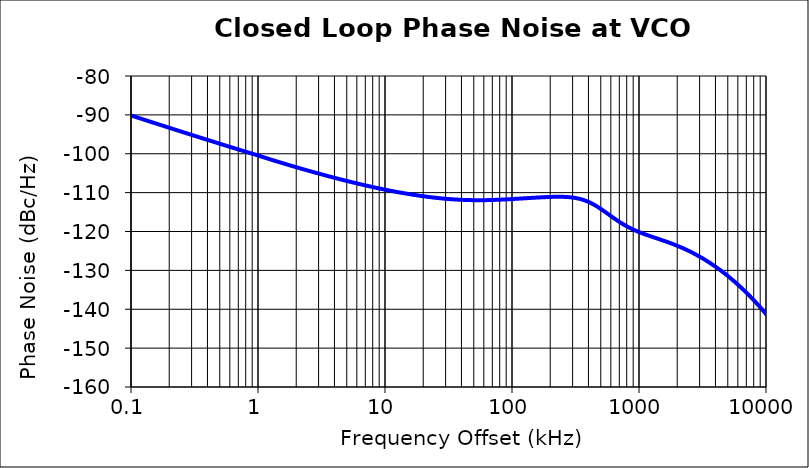
| Category | Series 2 |
|---|---|
| 0.1 | -90.148 |
| 0.1122018454301966 | -90.679 |
| 0.12589254117941703 | -91.208 |
| 0.14125375446227575 | -91.735 |
| 0.15848931924611176 | -92.261 |
| 0.17782794100389276 | -92.786 |
| 0.19952623149688853 | -93.309 |
| 0.22387211385683461 | -93.83 |
| 0.2511886431509588 | -94.35 |
| 0.28183829312644626 | -94.868 |
| 0.316227766016839 | -95.384 |
| 0.3548133892335767 | -95.899 |
| 0.39810717055349865 | -96.412 |
| 0.44668359215096465 | -96.923 |
| 0.501187233627274 | -97.432 |
| 0.5623413251903512 | -97.94 |
| 0.6309573444801956 | -98.445 |
| 0.7079457843841407 | -98.947 |
| 0.7943282347242847 | -99.447 |
| 0.8912509381337492 | -99.945 |
| 1.0 | -100.44 |
| 1.122018454301966 | -100.966 |
| 1.2589254117941702 | -101.482 |
| 1.4125375446227577 | -101.989 |
| 1.5848931924611176 | -102.486 |
| 1.7782794100389276 | -102.975 |
| 1.9952623149688853 | -103.456 |
| 2.2387211385683456 | -103.929 |
| 2.5118864315095877 | -104.394 |
| 2.818382931264463 | -104.85 |
| 3.1622776601683897 | -105.299 |
| 3.548133892335767 | -105.739 |
| 3.9810717055349865 | -106.17 |
| 4.466835921509647 | -106.592 |
| 5.011872336272741 | -107.004 |
| 5.623413251903512 | -107.406 |
| 6.309573444801956 | -107.797 |
| 7.079457843841406 | -108.176 |
| 7.943282347242847 | -108.543 |
| 8.912509381337491 | -108.897 |
| 10.0 | -109.238 |
| 11.22018454301966 | -109.561 |
| 12.589254117941703 | -109.869 |
| 14.125375446227576 | -110.16 |
| 15.848931924611176 | -110.434 |
| 17.782794100389278 | -110.689 |
| 19.952623149688854 | -110.924 |
| 22.387211385683457 | -111.139 |
| 25.118864315095877 | -111.331 |
| 28.183829312644626 | -111.499 |
| 31.6227766016839 | -111.642 |
| 35.48133892335767 | -111.759 |
| 39.81071705534986 | -111.848 |
| 44.668359215096466 | -111.909 |
| 50.1187233627274 | -111.943 |
| 56.23413251903512 | -111.949 |
| 63.09573444801956 | -111.929 |
| 70.79457843841408 | -111.886 |
| 79.43282347242847 | -111.823 |
| 89.12509381337492 | -111.744 |
| 100.0 | -111.653 |
| 112.20184543019658 | -111.556 |
| 125.89254117941702 | -111.455 |
| 141.25375446227577 | -111.356 |
| 158.48931924611176 | -111.262 |
| 177.82794100389276 | -111.178 |
| 199.52623149688853 | -111.111 |
| 223.8721138568346 | -111.072 |
| 251.1886431509588 | -111.082 |
| 281.8382931264463 | -111.17 |
| 316.2277660168389 | -111.378 |
| 354.8133892335767 | -111.759 |
| 398.1071705534987 | -112.356 |
| 446.68359215096467 | -113.186 |
| 501.18723362727405 | -114.213 |
| 562.3413251903512 | -115.36 |
| 630.9573444801955 | -116.526 |
| 707.9457843841408 | -117.624 |
| 794.3282347242847 | -118.599 |
| 891.2509381337492 | -119.435 |
| 1000.0 | -120.146 |
| 1122.018454301966 | -120.766 |
| 1258.9254117941703 | -121.333 |
| 1412.5375446227577 | -121.879 |
| 1584.8931924611177 | -122.436 |
| 1778.2794100389276 | -123.024 |
| 1995.2623149688852 | -123.662 |
| 2238.721138568346 | -124.36 |
| 2511.886431509588 | -125.128 |
| 2818.382931264463 | -125.973 |
| 3162.277660168389 | -126.898 |
| 3548.133892335767 | -127.907 |
| 3981.071705534987 | -129.004 |
| 4466.835921509647 | -130.19 |
| 5011.8723362727405 | -131.468 |
| 5623.413251903512 | -132.841 |
| 6309.573444801955 | -134.311 |
| 7079.457843841408 | -135.881 |
| 7943.282347242847 | -137.553 |
| 8912.509381337492 | -139.33 |
| 10000.0 | -141.219 |
| 11220.1845430197 | -143.226 |
| 12589.2541179417 | -145.363 |
| 14125.3754462276 | -147.646 |
| 15848.9319246112 | -150.099 |
| 17782.7941003893 | -152.754 |
| 19952.6231496889 | -155.658 |
| 22387.2113856835 | -158.873 |
| 25118.8643150959 | -162.48 |
| 28183.8293126446 | -166.57 |
| 31622.7766016839 | -171.17 |
| 35481.3389233577 | -175.925 |
| 39810.7170553499 | -179.549 |
| 44668.3592150965 | -181.295 |
| 50118.7233627274 | -182.345 |
| 56234.1325190351 | -183.337 |
| 63095.7344480195 | -184.24 |
| 70794.5784384141 | -185.185 |
| 79432.8234724285 | -186.281 |
| 89125.0938133749 | -187.368 |
| 100000.0 | -188.379 |